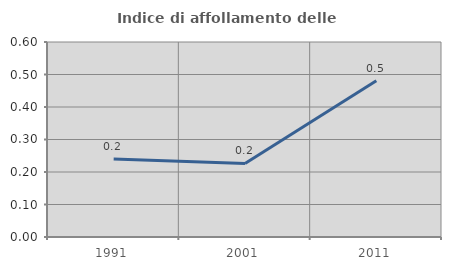
| Category | Indice di affollamento delle abitazioni  |
|---|---|
| 1991.0 | 0.24 |
| 2001.0 | 0.226 |
| 2011.0 | 0.481 |